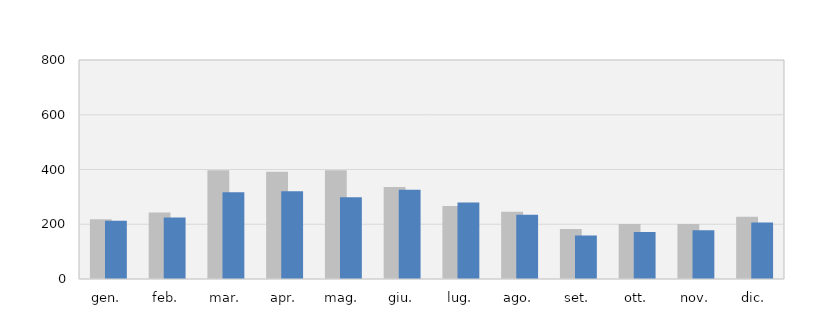
| Category | 2017 | 2018 |
|---|---|---|
| gen. | 218 | 213 |
| feb. | 243 | 225 |
| mar. | 397 | 317 |
| apr. | 392 | 321 |
| mag. | 397 | 299 |
| giu. | 336 | 326 |
| lug. | 267 | 279 |
| ago. | 246 | 235 |
| set. | 183 | 159 |
| ott. | 201 | 172 |
| nov. | 201 | 178 |
| dic. | 227 | 206 |